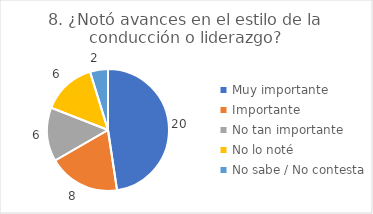
| Category | 8. ¿Notó avances en el estilo de la conducción o liderazgo? |
|---|---|
| Muy importante  | 0.476 |
| Importante  | 0.19 |
| No tan importante  | 0.143 |
| No lo noté  | 0.143 |
| No sabe / No contesta | 0.048 |